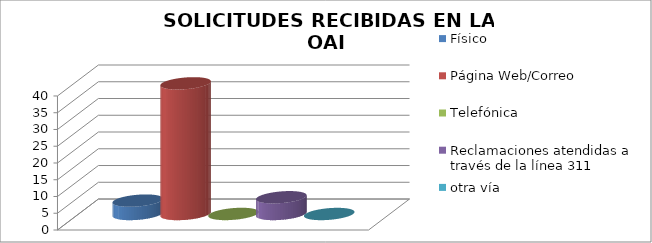
| Category | Físico | Página Web/Correo | Telefónica | Reclamaciones atendidas a través de la línea 311 | otra vía |
|---|---|---|---|---|---|
| 0 | 4 | 39 | 0.02 | 5 | 0 |